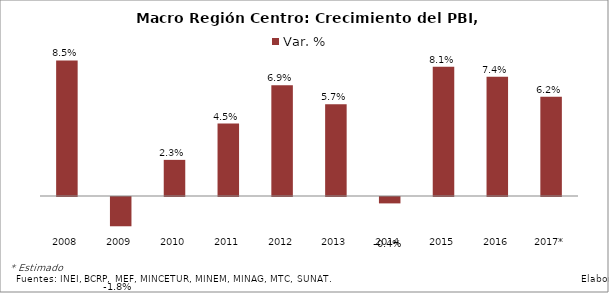
| Category | Var. % |
|---|---|
| 2008 | 0.085 |
| 2009 | -0.018 |
| 2010 | 0.023 |
| 2011 | 0.045 |
| 2012 | 0.069 |
| 2013 | 0.057 |
| 2014 | -0.004 |
| 2015 | 0.081 |
| 2016 | 0.074 |
| 2017* | 0.062 |